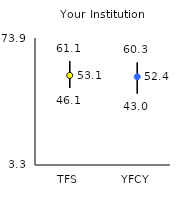
| Category | 25th | 75th | Mean |
|---|---|---|---|
| TFS | 46.1 | 61.1 | 53.09 |
| YFCY | 43 | 60.3 | 52.37 |